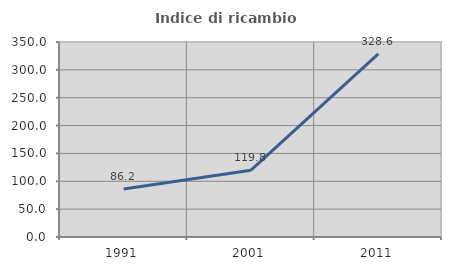
| Category | Indice di ricambio occupazionale  |
|---|---|
| 1991.0 | 86.207 |
| 2001.0 | 119.841 |
| 2011.0 | 328.571 |